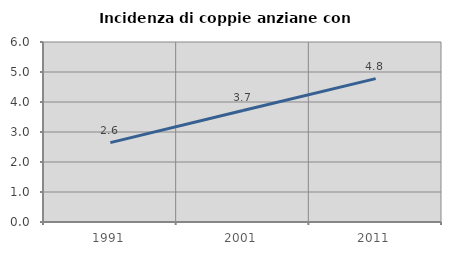
| Category | Incidenza di coppie anziane con figli |
|---|---|
| 1991.0 | 2.645 |
| 2001.0 | 3.719 |
| 2011.0 | 4.779 |